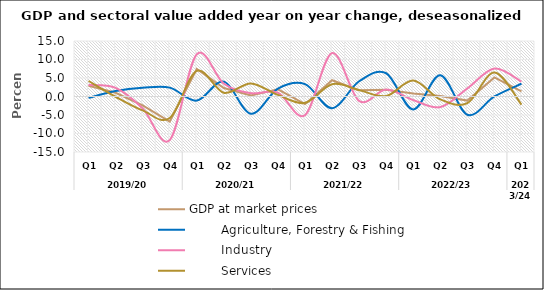
| Category | GDP at market prices |         Agriculture, Forestry & Fishing |         Industry |         Services |
|---|---|---|---|---|
| 0 | 2.894 | -0.354 | 3.114 | 4.188 |
| 1 | 1.021 | 1.459 | 2.336 | -0.067 |
| 2 | -2.394 | 2.337 | -3.216 | -3.759 |
| 3 | -6.755 | 2.4 | -11.789 | -5.816 |
| 4 | 7.455 | -1.112 | 11.403 | 6.916 |
| 5 | 2.307 | 4.024 | 3.468 | 0.991 |
| 6 | 0.306 | -4.669 | 0.895 | 3.542 |
| 7 | 1.952 | 2.132 | 1.028 | 0.426 |
| 8 | -2.065 | 3.353 | -5.045 | -1.712 |
| 9 | 4.392 | -3.17 | 11.731 | 3.325 |
| 10 | 1.717 | 4.119 | -1.201 | 1.726 |
| 11 | 1.822 | 6.285 | 1.875 | 0.133 |
| 12 | 0.817 | -3.497 | -0.966 | 4.296 |
| 13 | 0.127 | 5.754 | -2.867 | -0.793 |
| 14 | -1.108 | -4.929 | 2.18 | -1.782 |
| 15 | 5.153 | 0.008 | 7.556 | 6.461 |
| 16 | 1.355 | 3.441 | 4.014 | -2.205 |